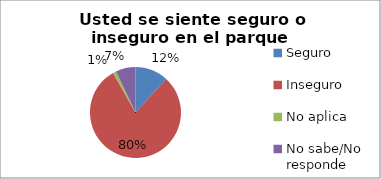
| Category | Series 0 |
|---|---|
| Seguro | 0.118 |
| Inseguro | 0.8 |
| No aplica | 0.012 |
| No sabe/No responde | 0.071 |